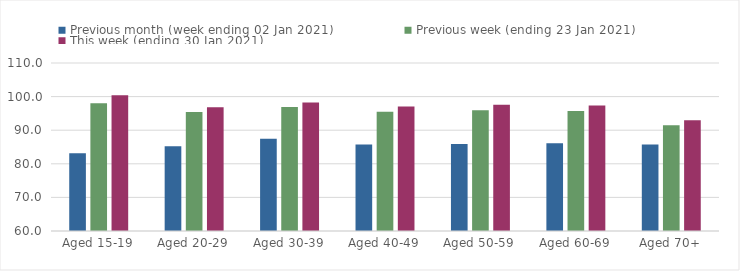
| Category | Previous month (week ending 02 Jan 2021) | Previous week (ending 23 Jan 2021) | This week (ending 30 Jan 2021) |
|---|---|---|---|
| Aged 15-19 | 83.16 | 98.01 | 100.4 |
| Aged 20-29 | 85.23 | 95.39 | 96.86 |
| Aged 30-39 | 87.42 | 96.93 | 98.22 |
| Aged 40-49 | 85.71 | 95.47 | 97.03 |
| Aged 50-59 | 85.9 | 95.95 | 97.54 |
| Aged 60-69 | 86.13 | 95.73 | 97.36 |
| Aged 70+ | 85.71 | 91.46 | 92.97 |